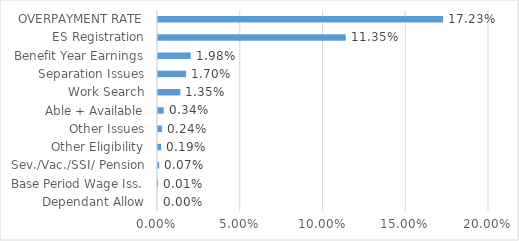
| Category | Series 0 |
|---|---|
| Dependant Allow | 0 |
| Base Period Wage Iss. | 0 |
| Sev./Vac./SSI/ Pension | 0.001 |
| Other Eligibility | 0.002 |
| Other Issues | 0.002 |
| Able + Available | 0.003 |
| Work Search | 0.014 |
| Separation Issues | 0.017 |
| Benefit Year Earnings | 0.02 |
| ES Registration | 0.113 |
| OVERPAYMENT RATE | 0.172 |